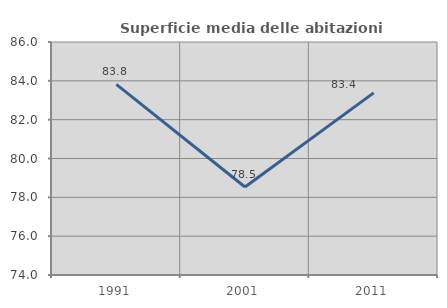
| Category | Superficie media delle abitazioni occupate |
|---|---|
| 1991.0 | 83.821 |
| 2001.0 | 78.531 |
| 2011.0 | 83.381 |